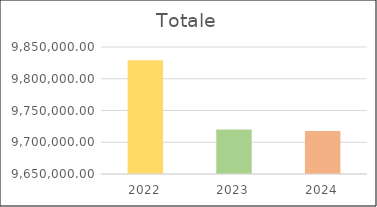
| Category | Series 0 |
|---|---|
| 2022.0 | 9829276 |
| 2023.0 | 9719970 |
| 2024.0 | 9717553 |